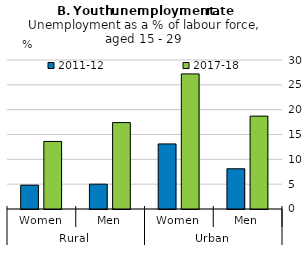
| Category | 2011-12 | 2017-18 |
|---|---|---|
| 0 | 4.8 | 13.6 |
| 1 | 5 | 17.4 |
| 2 | 13.1 | 27.2 |
| 3 | 8.1 | 18.7 |